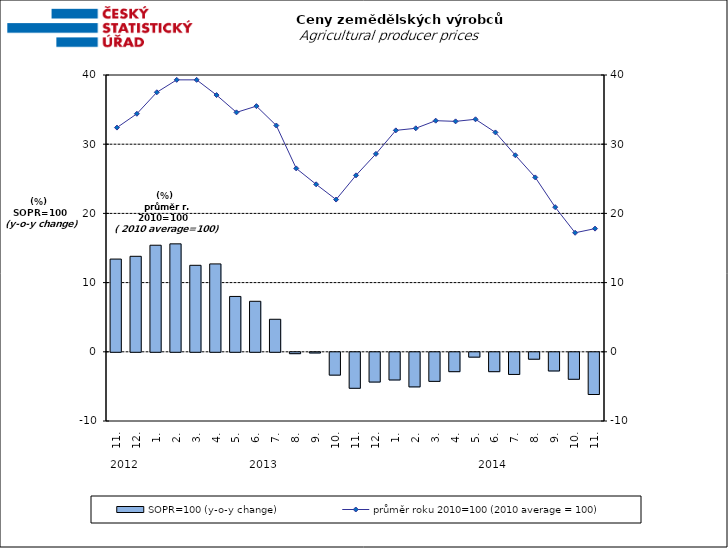
| Category | SOPR=100 (y-o-y change)   |
|---|---|
| 0 | 13.4 |
| 1 | 13.8 |
| 2 | 15.4 |
| 3 | 15.6 |
| 4 | 12.5 |
| 5 | 12.7 |
| 6 | 8 |
| 7 | 7.3 |
| 8 | 4.7 |
| 9 | -0.2 |
| 10 | -0.1 |
| 11 | -3.3 |
| 12 | -5.2 |
| 13 | -4.3 |
| 14 | -4 |
| 15 | -5 |
| 16 | -4.2 |
| 17 | -2.8 |
| 18 | -0.7 |
| 19 | -2.8 |
| 20 | -3.2 |
| 21 | -1 |
| 22 | -2.7 |
| 23 | -3.9 |
| 24 | -6.1 |